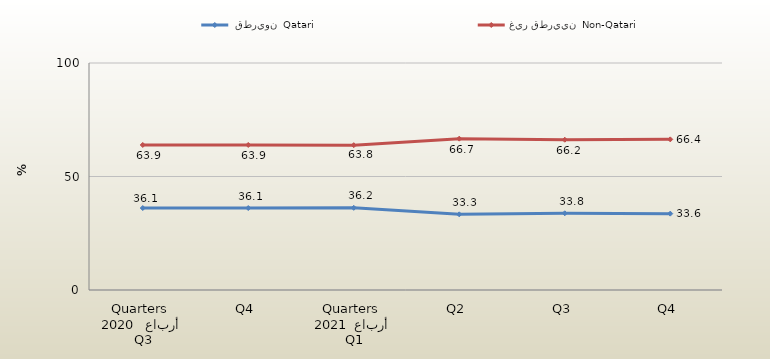
| Category |  قطريون  Qatari | غير قطريين  Non-Qatari |
|---|---|---|
| 0 | 36.111 | 63.889 |
| 1 | 36.111 | 63.889 |
| 2 | 36.207 | 63.793 |
| 3 | 33.333 | 66.667 |
| 4 | 33.8 | 66.2 |
| 5 | 33.641 | 66.359 |